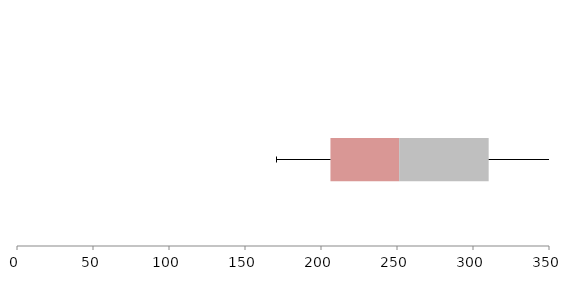
| Category | Series 1 | Series 2 | Series 3 |
|---|---|---|---|
| 0 | 206.224 | 45.187 | 58.897 |